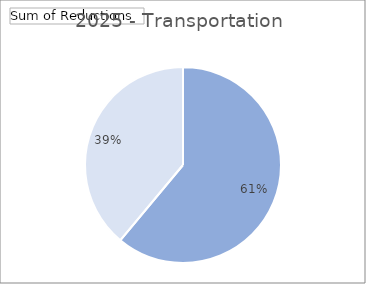
| Category | 2025 |
|---|---|
| 0 | 0.611 |
| 1 | 0.389 |